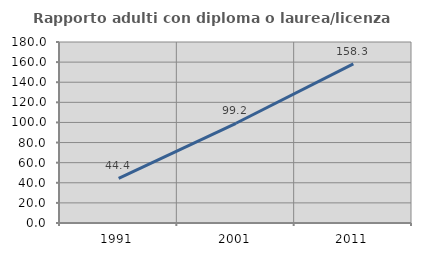
| Category | Rapporto adulti con diploma o laurea/licenza media  |
|---|---|
| 1991.0 | 44.419 |
| 2001.0 | 99.163 |
| 2011.0 | 158.263 |